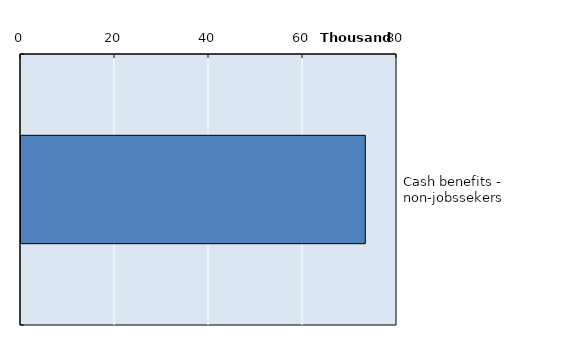
| Category | Series 0 |
|---|---|
| Cash benefits - non-jobssekers | 73253 |